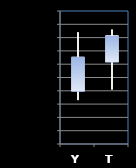
| Category | Series 0 | Series 1 | Series 2 | Series 3 |
|---|---|---|---|---|
| Y | 1469.75 | 1492 | 1466.5 | 1482.75 |
| T | 1480.75 | 1493 | 1470.5 | 1490.75 |